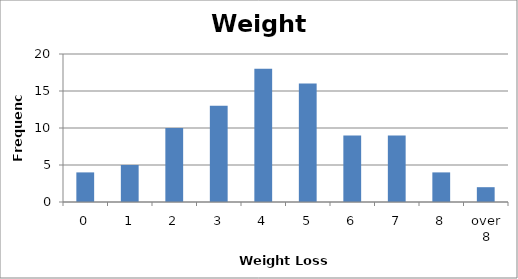
| Category | Series 0 |
|---|---|
| 0 | 4 |
| 1 | 5 |
| 2 | 10 |
| 3 | 13 |
| 4 | 18 |
| 5 | 16 |
| 6 | 9 |
| 7 | 9 |
| 8 | 4 |
| over 8 | 2 |